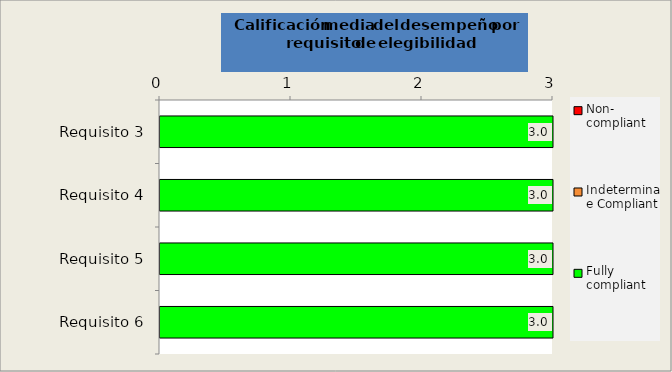
| Category | Series 0 | Series 1 | Series 2 | Series 3 | Non- compliant | Indeterminate Compliant | Fully compliant |
|---|---|---|---|---|---|---|---|
| Requisito 3 |  |  | 3 |  | 0 | 0 | 3 |
| Requisito 4 |  |  | 3 |  | 0 | 0 | 3 |
| Requisito 5 |  |  | 3 |  | 0 | 0 | 3 |
| Requisito 6 |  |  | 3 |  | 0 | 0 | 3 |